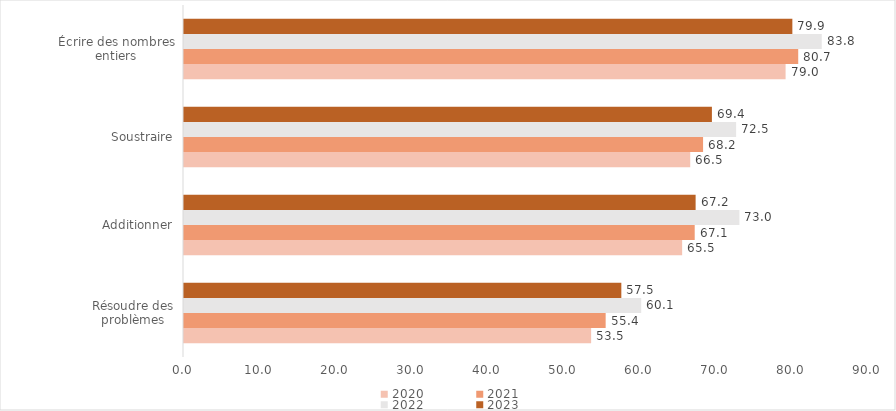
| Category | 2020 | 2021 | 2022 | 2023 |
|---|---|---|---|---|
| Résoudre des problèmes | 53.49 | 55.4 | 60.07 | 57.46 |
| Additionner | 65.45 | 67.1 | 72.97 | 67.22 |
| Soustraire | 66.51 | 68.2 | 72.54 | 69.36 |
| Écrire des nombres entiers | 79.04 | 80.7 | 83.79 | 79.93 |